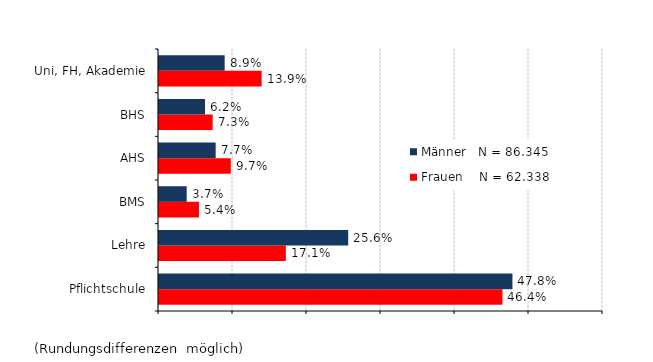
| Category | Frauen    N = 62.338 | Männer   N = 86.345 |
|---|---|---|
| Pflichtschule | 0.464 | 0.478 |
| Lehre | 0.171 | 0.256 |
| BMS | 0.054 | 0.037 |
| AHS | 0.097 | 0.077 |
| BHS | 0.073 | 0.062 |
| Uni, FH, Akademie | 0.139 | 0.089 |